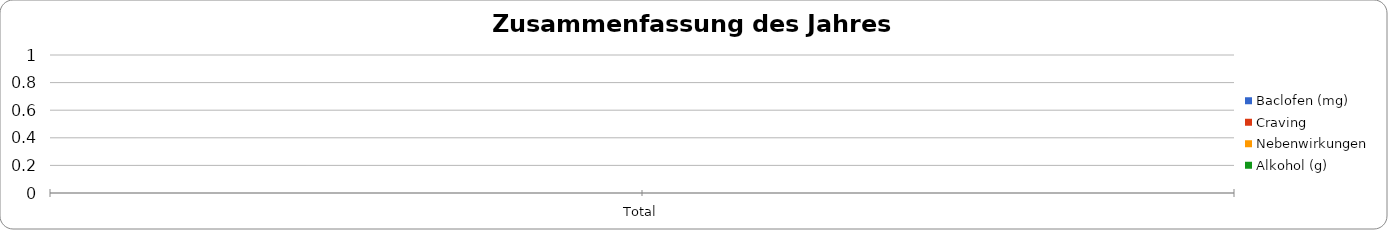
| Category | Baclofen (mg) | Craving | Nebenwirkungen | Alkohol (g) |
|---|---|---|---|---|
| Total | 0 | 0 | 0 | 0 |